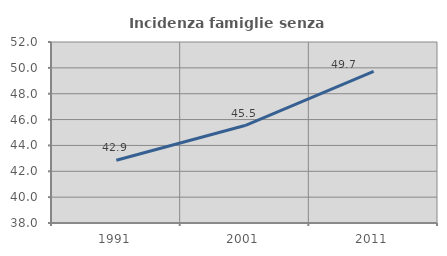
| Category | Incidenza famiglie senza nuclei |
|---|---|
| 1991.0 | 42.857 |
| 2001.0 | 45.54 |
| 2011.0 | 49.724 |